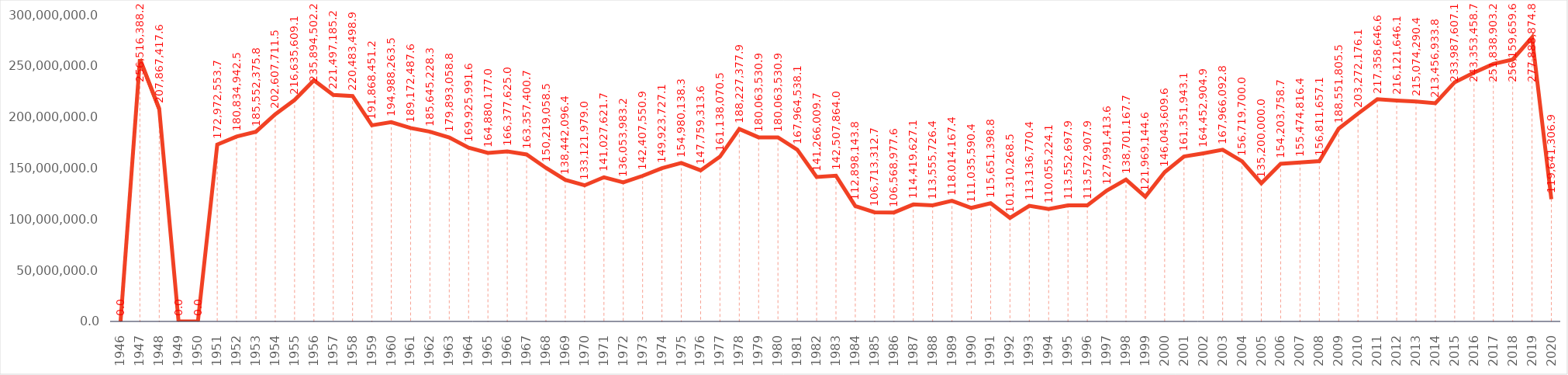
| Category | Series 0 |
|---|---|
| 1946.0 | 0 |
| 1947.0 | 256516388.178 |
| 1948.0 | 207867417.567 |
| 1949.0 | 0 |
| 1950.0 | 0 |
| 1951.0 | 172972553.71 |
| 1952.0 | 180834942.515 |
| 1953.0 | 185552375.798 |
| 1954.0 | 202607711.514 |
| 1955.0 | 216635609.106 |
| 1956.0 | 235894502.233 |
| 1957.0 | 221497185.195 |
| 1958.0 | 220483498.865 |
| 1959.0 | 191868451.235 |
| 1960.0 | 194988263.45 |
| 1961.0 | 189172487.647 |
| 1962.0 | 185645228.309 |
| 1963.0 | 179893058.813 |
| 1964.0 | 169925991.642 |
| 1965.0 | 164880176.968 |
| 1966.0 | 166377624.991 |
| 1967.0 | 163357400.652 |
| 1968.0 | 150219058.52 |
| 1969.0 | 138442096.367 |
| 1970.0 | 133121979.036 |
| 1971.0 | 141027621.67 |
| 1972.0 | 136053983.238 |
| 1973.0 | 142407550.893 |
| 1974.0 | 149923727.077 |
| 1975.0 | 154980138.32 |
| 1976.0 | 147759313.639 |
| 1977.0 | 161138070.506 |
| 1978.0 | 188227377.908 |
| 1979.0 | 180063530.878 |
| 1980.0 | 180063530.878 |
| 1981.0 | 167964538.133 |
| 1982.0 | 141266009.733 |
| 1983.0 | 142507863.976 |
| 1984.0 | 112898143.814 |
| 1985.0 | 106713312.671 |
| 1986.0 | 106568977.626 |
| 1987.0 | 114419627.068 |
| 1988.0 | 113555726.352 |
| 1989.0 | 118014167.381 |
| 1990.0 | 111035590.441 |
| 1991.0 | 115651398.801 |
| 1992.0 | 101310268.494 |
| 1993.0 | 113136770.404 |
| 1994.0 | 110055224.128 |
| 1995.0 | 113552697.859 |
| 1996.0 | 113572907.885 |
| 1997.0 | 127991413.594 |
| 1998.0 | 138701167.706 |
| 1999.0 | 121969144.561 |
| 2000.0 | 146043609.626 |
| 2001.0 | 161351943.141 |
| 2002.0 | 164452904.946 |
| 2003.0 | 167966092.8 |
| 2004.0 | 156719700 |
| 2005.0 | 135200000 |
| 2006.0 | 154203758.655 |
| 2007.0 | 155474816.39 |
| 2008.0 | 156811657.137 |
| 2009.0 | 188551805.463 |
| 2010.0 | 203272176.089 |
| 2011.0 | 217358646.577 |
| 2012.0 | 216121646.149 |
| 2013.0 | 215074290.386 |
| 2014.0 | 213456933.771 |
| 2015.0 | 233987607.081 |
| 2016.0 | 243353458.685 |
| 2017.0 | 251838903.173 |
| 2018.0 | 256159659.622 |
| 2019.0 | 277888874.797 |
| 2020.0 | 119641306.909 |